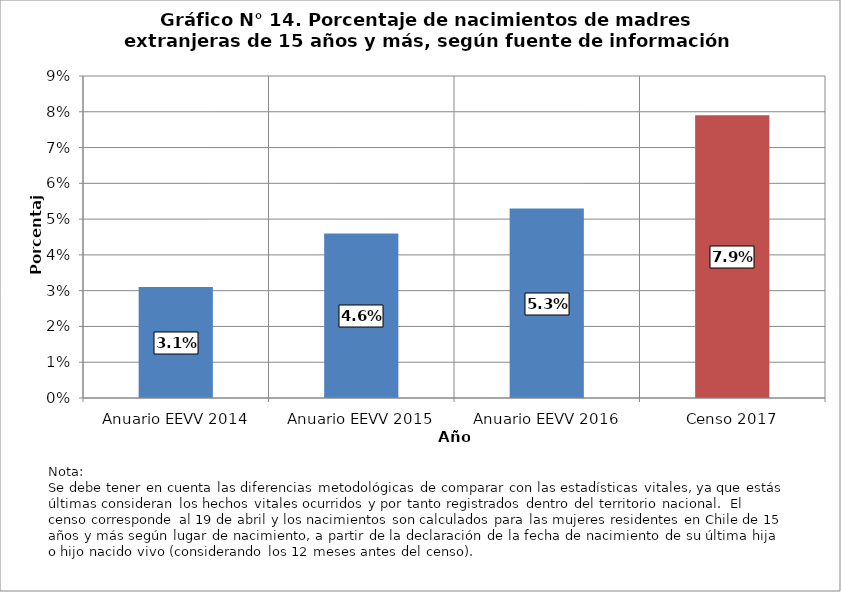
| Category | Series 0 |
|---|---|
| Anuario EEVV 2014 | 0.031 |
| Anuario EEVV 2015 | 0.046 |
| Anuario EEVV 2016 | 0.053 |
| Censo 2017 | 0.079 |